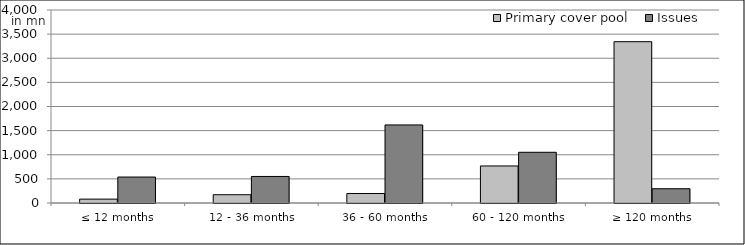
| Category | Primary cover pool | Issues |
|---|---|---|
| ≤ 12 months | 80469630.455 | 538000000 |
| 12 - 36 months | 171445511.605 | 550150000 |
| 36 - 60 months | 195949181.79 | 1618000000 |
| 60 - 120 months | 767639877.2 | 1051000000 |
| ≥ 120 months | 3343168018.48 | 295673602.88 |